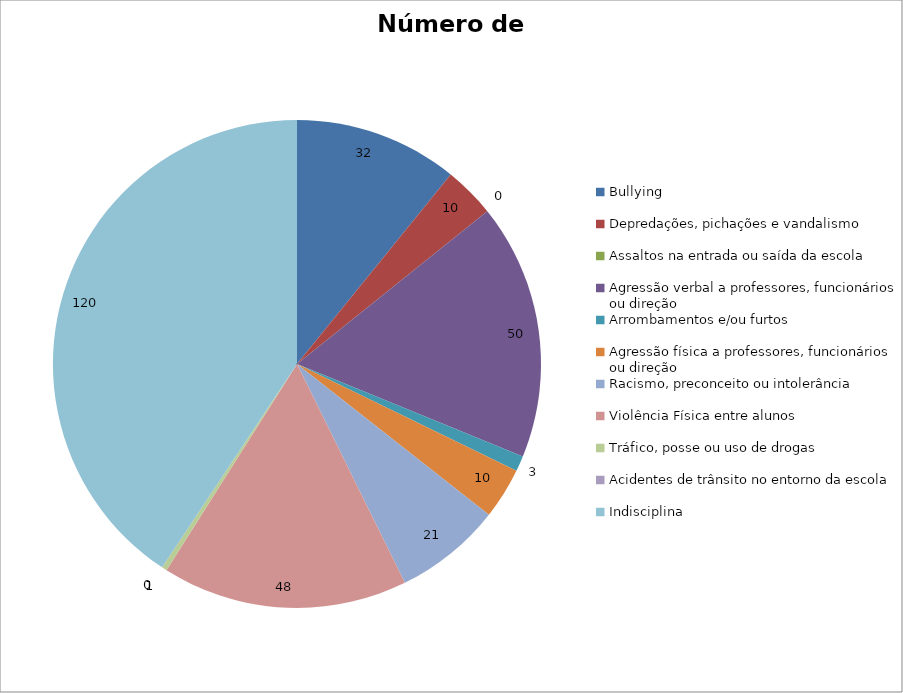
| Category | Número de Casos |
|---|---|
| Bullying | 32 |
| Depredações, pichações e vandalismo | 10 |
| Assaltos na entrada ou saída da escola | 0 |
| Agressão verbal a professores, funcionários ou direção | 50 |
| Arrombamentos e/ou furtos | 3 |
| Agressão física a professores, funcionários ou direção | 10 |
| Racismo, preconceito ou intolerância | 21 |
| Violência Física entre alunos | 48 |
| Tráfico, posse ou uso de drogas | 1 |
| Acidentes de trânsito no entorno da escola | 0 |
| Indisciplina | 120 |